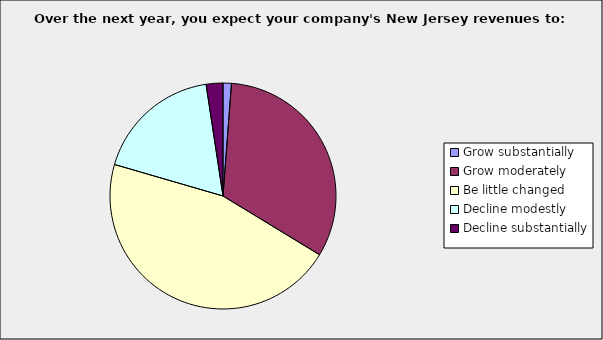
| Category | Series 0 |
|---|---|
| Grow substantially | 0.012 |
| Grow moderately | 0.325 |
| Be little changed | 0.458 |
| Decline modestly | 0.181 |
| Decline substantially | 0.024 |